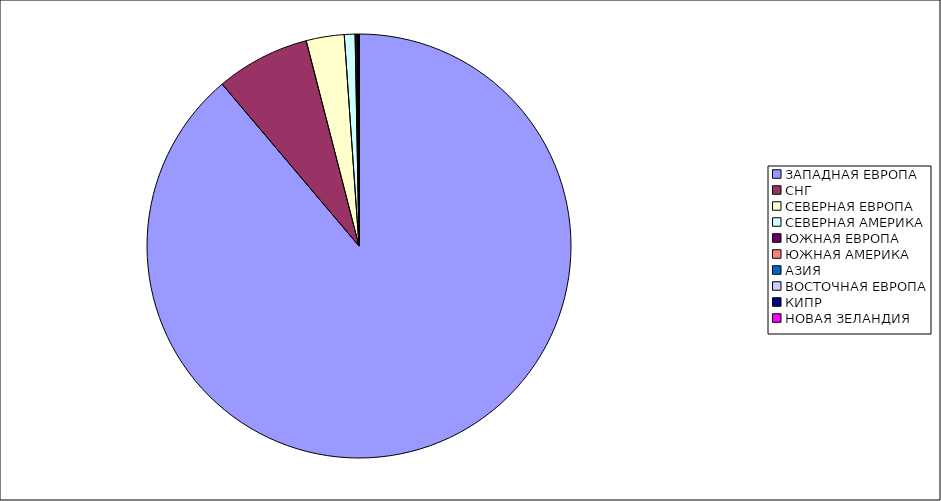
| Category | Оборот |
|---|---|
| ЗАПАДНАЯ ЕВРОПА | 0.888 |
| СНГ | 0.072 |
| СЕВЕРНАЯ ЕВРОПА | 0.029 |
| СЕВЕРНАЯ АМЕРИКА | 0.008 |
| ЮЖНАЯ ЕВРОПА | 0.002 |
| ЮЖНАЯ АМЕРИКА | 0.001 |
| АЗИЯ | 0.001 |
| ВОСТОЧНАЯ ЕВРОПА | 0 |
| КИПР | 0 |
| НОВАЯ ЗЕЛАНДИЯ | 0 |